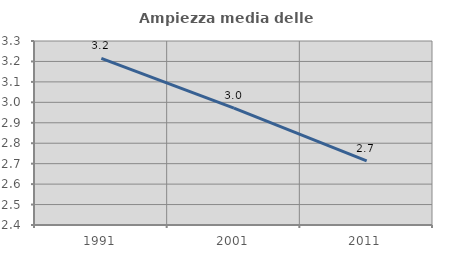
| Category | Ampiezza media delle famiglie |
|---|---|
| 1991.0 | 3.215 |
| 2001.0 | 2.972 |
| 2011.0 | 2.714 |